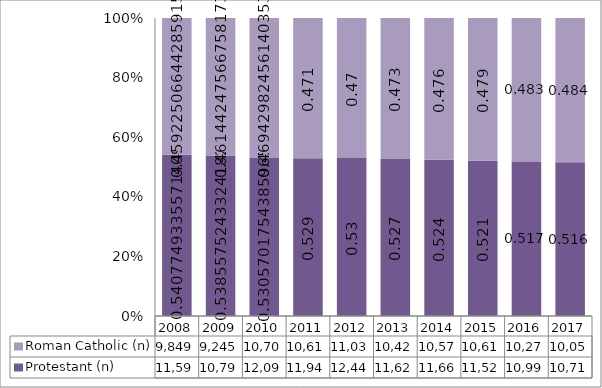
| Category | Protestant (n) | Roman Catholic (n) |
|---|---|---|
| 2008.0 | 11598 | 9849 |
| 2009.0 | 10790 | 9245 |
| 2010.0 | 12097 | 10704 |
| 2011.0 | 11942 | 10613 |
| 2012.0 | 12441 | 11032 |
| 2013.0 | 11623 | 10425 |
| 2014.0 | 11661 | 10575 |
| 2015.0 | 11521 | 10610 |
| 2016.0 | 10995 | 10276 |
| 2017.0 | 10719 | 10053 |